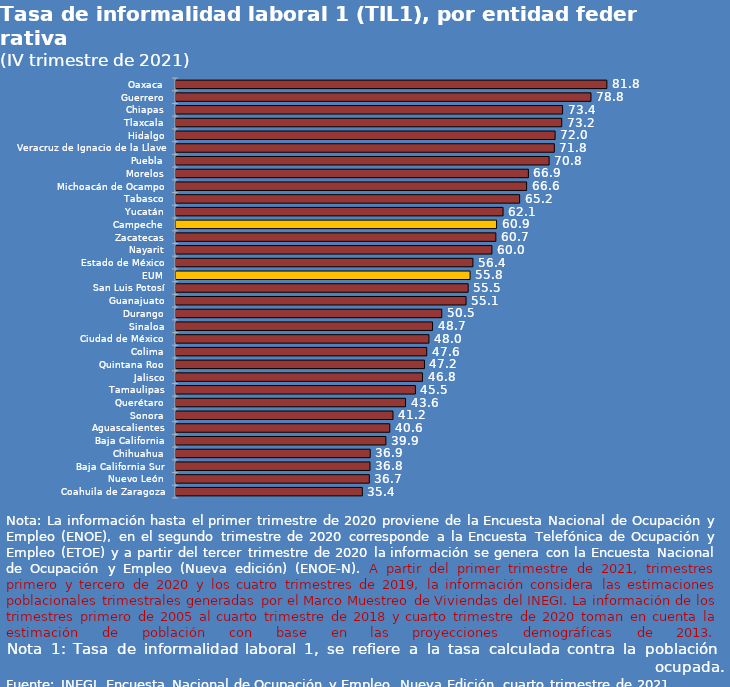
| Category | Series 0 |
|---|---|
| Oaxaca | 81.803 |
| Guerrero | 78.794 |
| Chiapas | 73.4 |
| Tlaxcala | 73.237 |
| Hidalgo | 71.979 |
| Veracruz de Ignacio de la Llave | 71.834 |
| Puebla | 70.846 |
| Morelos | 66.908 |
| Michoacán de Ocampo | 66.57 |
| Tabasco | 65.248 |
| Yucatán | 62.103 |
| Campeche | 60.874 |
| Zacatecas | 60.733 |
| Nayarit | 59.987 |
| Estado de México | 56.373 |
| EUM | 55.836 |
| San Luis Potosí | 55.468 |
| Guanajuato | 55.073 |
| Durango | 50.463 |
| Sinaloa | 48.711 |
| Ciudad de México | 48.026 |
| Colima | 47.606 |
| Quintana Roo | 47.18 |
| Jalisco | 46.804 |
| Tamaulipas | 45.455 |
| Querétaro | 43.584 |
| Sonora | 41.202 |
| Aguascalientes | 40.59 |
| Baja California | 39.851 |
| Chihuahua | 36.877 |
| Baja California Sur | 36.832 |
| Nuevo León | 36.706 |
| Coahuila de Zaragoza | 35.38 |